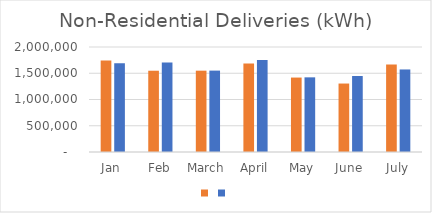
| Category | Series 1 | Series 0 |
|---|---|---|
| Jan | 1741151 | 1691318 |
| Feb | 1548063 | 1705422 |
| March | 1549153 | 1550355 |
| April | 1684677 | 1750598 |
| May | 1417925 | 1421957 |
| June | 1304116 | 1447306 |
| July | 1664865 | 1572197 |